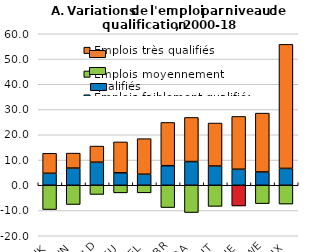
| Category | Emplois faiblement qualifiés  | Emplois moyennement qualifiés | Emplois très qualifiés |
|---|---|---|---|
| DNK | 4.737 | -9.622 | 7.923 |
| FIN | 6.792 | -7.622 | 5.941 |
| NLD | 9.124 | -3.639 | 6.391 |
| DEU | 4.923 | -3.011 | 12.238 |
| BEL | 4.376 | -3 | 14.08 |
| GBR | 7.741 | -8.834 | 17.136 |
| FRA | 9.386 | -10.805 | 17.472 |
| AUT | 7.612 | -8.372 | 17.023 |
| CHE | 6.351 | -8.192 | 20.909 |
| SWE | 5.271 | -7.288 | 23.304 |
| LUX | 6.67 | -7.449 | 49.138 |